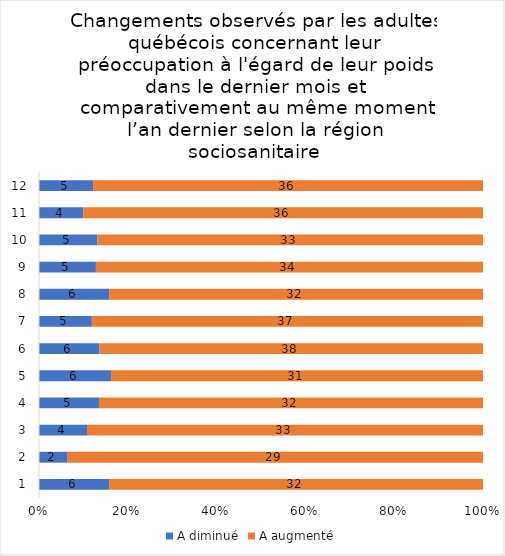
| Category | A diminué | A augmenté |
|---|---|---|
| 0 | 6 | 32 |
| 1 | 2 | 29 |
| 2 | 4 | 33 |
| 3 | 5 | 32 |
| 4 | 6 | 31 |
| 5 | 6 | 38 |
| 6 | 5 | 37 |
| 7 | 6 | 32 |
| 8 | 5 | 34 |
| 9 | 5 | 33 |
| 10 | 4 | 36 |
| 11 | 5 | 36 |